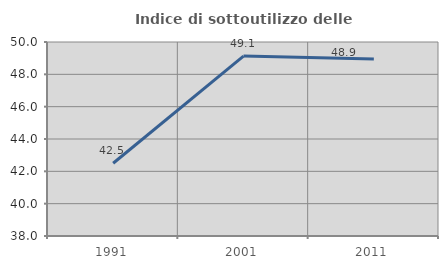
| Category | Indice di sottoutilizzo delle abitazioni  |
|---|---|
| 1991.0 | 42.5 |
| 2001.0 | 49.128 |
| 2011.0 | 48.947 |